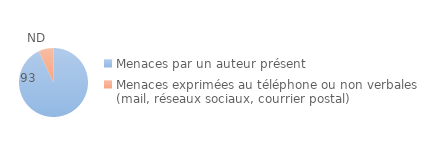
| Category | Series 0 |
|---|---|
| Menaces par un auteur présent | 93 |
| Menaces exprimées au téléphone ou non verbales (mail, réseaux sociaux, courrier postal) | 7 |